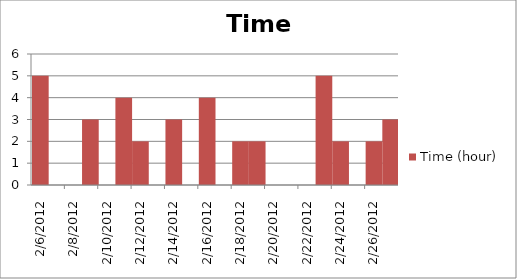
| Category | Time (hour) |
|---|---|
| 2/6/12 | 5 |
| 2/7/12 | 0 |
| 2/9/12 | 3 |
| 2/11/12 | 4 |
| 2/12/12 | 2 |
| 2/14/12 | 3 |
| 2/16/12 | 4 |
| 2/18/12 | 2 |
| 2/19/12 | 2 |
| 2/20/12 | 0 |
| 2/21/12 | 0 |
| 2/23/12 | 5 |
| 2/24/12 | 2 |
| 2/26/12 | 2 |
| 2/27/12 | 3 |